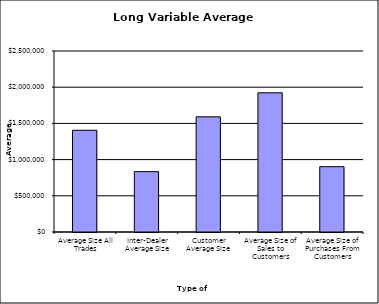
| Category | Security Type |
|---|---|
| Average Size All Trades | 1405224.144 |
| Inter-Dealer Average Size | 833530.827 |
| Customer Average Size | 1590495.127 |
| Average Size of Sales to Customers | 1922671.965 |
| Average Size of Purchases From Customers | 902272.455 |